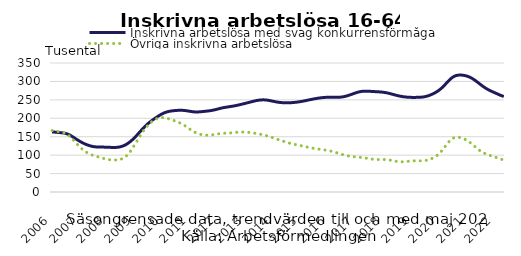
| Category | Inskrivna arbetslösa med svag konkurrensförmåga  | Övriga inskrivna arbetslösa |
|---|---|---|
| 2006 | 163.064 | 166.577 |
| 2006-02 | 162.551 | 165.714 |
| 2006-03 | 161.956 | 164.674 |
| 2006-04 | 161.341 | 163.478 |
| 2006-05 | 160.75 | 162.201 |
| 2006-06 | 160.004 | 160.557 |
| 2006-07 | 158.669 | 157.928 |
| 2006-08 | 156.408 | 153.91 |
| 2006-09 | 153.254 | 148.618 |
| 2006-10 | 149.438 | 142.353 |
| 2006-11 | 145.34 | 135.595 |
| 2006-12 | 141.306 | 128.787 |
| 2007 | 137.531 | 122.329 |
| 2007-02 | 134.107 | 116.559 |
| 2007-03 | 131.073 | 111.614 |
| 2007-04 | 128.425 | 107.448 |
| 2007-05 | 126.165 | 103.997 |
| 2007-06 | 124.352 | 101.179 |
| 2007-07 | 123.098 | 98.925 |
| 2007-08 | 122.374 | 97.024 |
| 2007-09 | 122.055 | 95.244 |
| 2007-10 | 121.926 | 93.444 |
| 2007-11 | 121.821 | 91.639 |
| 2007-12 | 121.666 | 89.958 |
| 2008 | 121.444 | 88.554 |
| 2008-02 | 121.181 | 87.534 |
| 2008-03 | 120.942 | 86.904 |
| 2008-04 | 120.869 | 86.71 |
| 2008-05 | 121.139 | 86.967 |
| 2008-06 | 121.927 | 87.785 |
| 2008-07 | 123.358 | 89.41 |
| 2008-08 | 125.572 | 92.264 |
| 2008-09 | 128.624 | 96.712 |
| 2008-10 | 132.538 | 102.935 |
| 2008-11 | 137.272 | 110.822 |
| 2008-12 | 142.747 | 120.039 |
| 2009 | 148.894 | 130.107 |
| 2009-02 | 155.593 | 140.457 |
| 2009-03 | 162.595 | 150.64 |
| 2009-04 | 169.58 | 160.298 |
| 2009-05 | 176.229 | 169.16 |
| 2009-06 | 182.309 | 177.063 |
| 2009-07 | 187.738 | 183.883 |
| 2009-08 | 192.616 | 189.578 |
| 2009-09 | 197.141 | 194.164 |
| 2009-10 | 201.465 | 197.682 |
| 2009-11 | 205.602 | 200.129 |
| 2009-12 | 209.465 | 201.495 |
| 2010 | 212.843 | 201.79 |
| 2010-02 | 215.567 | 201.148 |
| 2010-03 | 217.606 | 199.776 |
| 2010-04 | 219.046 | 197.898 |
| 2010-05 | 220.037 | 195.754 |
| 2010-06 | 220.746 | 193.499 |
| 2010-07 | 221.291 | 191.17 |
| 2010-08 | 221.646 | 188.632 |
| 2010-09 | 221.707 | 185.673 |
| 2010-10 | 221.401 | 182.165 |
| 2010-11 | 220.732 | 178.145 |
| 2010-12 | 219.774 | 173.838 |
| 2011 | 218.72 | 169.519 |
| 2011-02 | 217.813 | 165.454 |
| 2011-03 | 217.261 | 161.901 |
| 2011-04 | 217.167 | 159.047 |
| 2011-05 | 217.491 | 156.943 |
| 2011-06 | 218.072 | 155.512 |
| 2011-07 | 218.728 | 154.625 |
| 2011-08 | 219.391 | 154.191 |
| 2011-09 | 220.135 | 154.218 |
| 2011-10 | 221.06 | 154.676 |
| 2011-11 | 222.247 | 155.503 |
| 2011-12 | 223.705 | 156.53 |
| 2012 | 225.327 | 157.561 |
| 2012-02 | 226.944 | 158.465 |
| 2012-03 | 228.396 | 159.132 |
| 2012-04 | 229.6 | 159.552 |
| 2012-05 | 230.593 | 159.84 |
| 2012-06 | 231.518 | 160.158 |
| 2012-07 | 232.505 | 160.616 |
| 2012-08 | 233.624 | 161.219 |
| 2012-09 | 234.876 | 161.838 |
| 2012-10 | 236.24 | 162.335 |
| 2012-11 | 237.714 | 162.615 |
| 2012-12 | 239.251 | 162.624 |
| 2013 | 240.819 | 162.395 |
| 2013-02 | 242.411 | 161.915 |
| 2013-03 | 244.028 | 161.22 |
| 2013-04 | 245.649 | 160.379 |
| 2013-05 | 247.174 | 159.404 |
| 2013-06 | 248.456 | 158.296 |
| 2013-07 | 249.39 | 157.072 |
| 2013-08 | 249.914 | 155.747 |
| 2013-09 | 249.954 | 154.307 |
| 2013-10 | 249.489 | 152.721 |
| 2013-11 | 248.558 | 150.938 |
| 2013-12 | 247.328 | 148.94 |
| 2014 | 246.022 | 146.798 |
| 2014-02 | 244.778 | 144.604 |
| 2014-03 | 243.706 | 142.434 |
| 2014-04 | 242.876 | 140.308 |
| 2014-05 | 242.323 | 138.244 |
| 2014-06 | 242.04 | 136.249 |
| 2014-07 | 241.988 | 134.332 |
| 2014-08 | 242.131 | 132.53 |
| 2014-09 | 242.478 | 130.906 |
| 2014-10 | 243.019 | 129.477 |
| 2014-11 | 243.717 | 128.193 |
| 2014-12 | 244.563 | 126.982 |
| 2015 | 245.547 | 125.722 |
| 2015-02 | 246.687 | 124.347 |
| 2015-03 | 247.957 | 122.918 |
| 2015-04 | 249.28 | 121.491 |
| 2015-05 | 250.594 | 120.152 |
| 2015-06 | 251.855 | 118.968 |
| 2015-07 | 253.03 | 117.934 |
| 2015-08 | 254.097 | 116.997 |
| 2015-09 | 255.043 | 116.091 |
| 2015-10 | 255.848 | 115.173 |
| 2015-11 | 256.474 | 114.22 |
| 2015-12 | 256.867 | 113.205 |
| 2016 | 257.014 | 112.081 |
| 2016-02 | 256.982 | 110.798 |
| 2016-03 | 256.869 | 109.266 |
| 2016-04 | 256.804 | 107.474 |
| 2016-05 | 256.908 | 105.495 |
| 2016-06 | 257.299 | 103.466 |
| 2016-07 | 258.079 | 101.551 |
| 2016-08 | 259.295 | 99.875 |
| 2016-09 | 260.928 | 98.497 |
| 2016-10 | 262.906 | 97.393 |
| 2016-11 | 265.12 | 96.499 |
| 2016-12 | 267.408 | 95.758 |
| 2017 | 269.557 | 95.099 |
| feb-17 | 271.35 | 94.466 |
| mar-17 | 272.646 | 93.808 |
| apr-17 | 273.389 | 93.059 |
| maj-17 | 273.622 | 92.152 |
| jun-17 | 273.478 | 91.104 |
| jul-17 | 273.116 | 90.029 |
| aug-17 | 272.702 | 89.092 |
| sep-17 | 272.333 | 88.42 |
| okt-17 | 271.987 | 88.059 |
| nov-17 | 271.593 | 87.965 |
| dec-17 | 271.061 | 87.995 |
| 2018 | 270.321 | 87.971 |
| feb-18 | 269.296 | 87.715 |
| mar-18 | 267.935 | 87.08 |
| apr-18 | 266.307 | 86.088 |
| maj-18 | 264.586 | 84.901 |
| jun-18 | 262.908 | 83.698 |
| jul-18 | 261.364 | 82.693 |
| aug-18 | 260.013 | 82.072 |
| sep-18 | 258.879 | 81.924 |
| okt-18 | 257.997 | 82.236 |
| nov-18 | 257.365 | 82.857 |
| dec-18 | 256.94 | 83.567 |
| 2019 | 256.705 | 84.176 |
| feb-19 | 256.651 | 84.564 |
| mar-19 | 256.74 | 84.664 |
| apr-19 | 256.929 | 84.562 |
| maj-19 | 257.237 | 84.47 |
| jun-19 | 257.833 | 84.709 |
| jul-19 | 258.966 | 85.505 |
| aug-19 | 260.692 | 86.929 |
| sep-19 | 262.945 | 88.964 |
| okt-19 | 265.653 | 91.565 |
| nov-19 | 268.785 | 94.859 |
| dec-19 | 272.455 | 99.121 |
| 2020 | 276.847 | 104.601 |
| feb-20 | 282.075 | 111.365 |
| mar-20 | 288.161 | 119.25 |
| apr-20 | 294.824 | 127.582 |
| maj-20 | 301.477 | 135.378 |
| jun-20 | 307.455 | 141.754 |
| jul-20 | 312.119 | 146.101 |
| aug-20 | 315.203 | 148.303 |
| sep-20 | 316.853 | 148.69 |
| okt-20 | 317.342 | 147.774 |
| nov-20 | 316.986 | 145.933 |
| dec-20 | 316.002 | 143.324 |
| 2021 | 314.394 | 139.968 |
| feb-21 | 312.097 | 135.854 |
| mar-21 | 309.009 | 131.008 |
| apr-21 | 305.139 | 125.687 |
| maj-21 | 300.691 | 120.321 |
| jun-21 | 295.877 | 115.215 |
| jul-21 | 291.012 | 110.693 |
| aug-21 | 286.41 | 106.933 |
| sep-21 | 282.204 | 103.87 |
| okt-21 | 278.473 | 101.356 |
| nov-21 | 275.215 | 99.208 |
| dec-21 | 272.298 | 97.215 |
| 2022 | 269.501 | 95.151 |
| feb-22 | 266.686 | 92.942 |
| mar-22 | 263.898 | 90.717 |
| apr-22 | 261.338 | 88.677 |
| maj-22 | 259.205 | 86.937 |